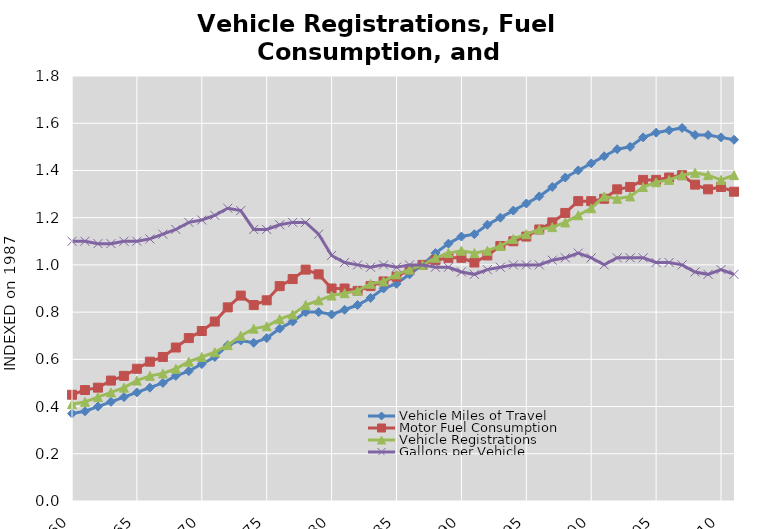
| Category | Vehicle Miles of Travel | Motor Fuel Consumption | Vehicle Registrations | Gallons per Vehicle |
|---|---|---|---|---|
| 1960.0 | 0.37 | 0.45 | 0.41 | 1.1 |
| 1961.0 | 0.38 | 0.47 | 0.42 | 1.1 |
| 1962.0 | 0.4 | 0.48 | 0.44 | 1.09 |
| 1963.0 | 0.42 | 0.51 | 0.46 | 1.09 |
| 1964.0 | 0.44 | 0.53 | 0.48 | 1.1 |
| 1965.0 | 0.46 | 0.56 | 0.51 | 1.1 |
| 1966.0 | 0.48 | 0.59 | 0.53 | 1.11 |
| 1967.0 | 0.5 | 0.61 | 0.54 | 1.13 |
| 1968.0 | 0.53 | 0.65 | 0.56 | 1.15 |
| 1969.0 | 0.55 | 0.69 | 0.59 | 1.18 |
| 1970.0 | 0.58 | 0.72 | 0.61 | 1.19 |
| 1971.0 | 0.61 | 0.76 | 0.63 | 1.21 |
| 1972.0 | 0.66 | 0.82 | 0.66 | 1.24 |
| 1973.0 | 0.68 | 0.87 | 0.7 | 1.23 |
| 1974.0 | 0.67 | 0.83 | 0.73 | 1.15 |
| 1975.0 | 0.69 | 0.85 | 0.74 | 1.15 |
| 1976.0 | 0.73 | 0.91 | 0.77 | 1.17 |
| 1977.0 | 0.76 | 0.94 | 0.79 | 1.18 |
| 1978.0 | 0.8 | 0.98 | 0.83 | 1.18 |
| 1979.0 | 0.8 | 0.96 | 0.85 | 1.13 |
| 1980.0 | 0.79 | 0.9 | 0.87 | 1.04 |
| 1981.0 | 0.81 | 0.9 | 0.88 | 1.01 |
| 1982.0 | 0.83 | 0.89 | 0.89 | 1 |
| 1983.0 | 0.86 | 0.91 | 0.92 | 0.99 |
| 1984.0 | 0.9 | 0.93 | 0.93 | 1 |
| 1985.0 | 0.92 | 0.95 | 0.96 | 0.99 |
| 1986.0 | 0.96 | 0.98 | 0.98 | 1 |
| 1987.0 | 1 | 1 | 1 | 1 |
| 1988.0 | 1.05 | 1.02 | 1.03 | 0.99 |
| 1989.0 | 1.09 | 1.03 | 1.05 | 0.99 |
| 1990.0 | 1.12 | 1.03 | 1.06 | 0.97 |
| 1991.0 | 1.13 | 1.01 | 1.05 | 0.96 |
| 1992.0 | 1.17 | 1.04 | 1.06 | 0.98 |
| 1993.0 | 1.2 | 1.08 | 1.08 | 0.99 |
| 1994.0 | 1.23 | 1.1 | 1.11 | 1 |
| 1995.0 | 1.26 | 1.12 | 1.13 | 1 |
| 1996.0 | 1.29 | 1.15 | 1.15 | 1 |
| 1997.0 | 1.33 | 1.18 | 1.16 | 1.02 |
| 1998.0 | 1.37 | 1.22 | 1.18 | 1.03 |
| 1999.0 | 1.4 | 1.27 | 1.21 | 1.05 |
| 2000.0 | 1.43 | 1.27 | 1.24 | 1.03 |
| 2001.0 | 1.46 | 1.28 | 1.29 | 1 |
| 2002.0 | 1.49 | 1.32 | 1.28 | 1.03 |
| 2003.0 | 1.5 | 1.33 | 1.29 | 1.03 |
| 2004.0 | 1.54 | 1.36 | 1.33 | 1.03 |
| 2005.0 | 1.56 | 1.36 | 1.35 | 1.01 |
| 2006.0 | 1.57 | 1.37 | 1.36 | 1.01 |
| 2007.0 | 1.58 | 1.38 | 1.38 | 1 |
| 2008.0 | 1.55 | 1.34 | 1.39 | 0.97 |
| 2009.0 | 1.55 | 1.32 | 1.38 | 0.96 |
| 2010.0 | 1.54 | 1.33 | 1.36 | 0.98 |
| 2011.0 | 1.53 | 1.31 | 1.38 | 0.96 |